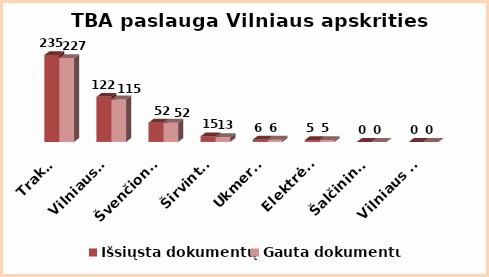
| Category | Išsiųsta dokumentų | Gauta dokumentų |
|---|---|---|
| Trakai | 235 | 227 |
| Vilniaus r. | 122 | 115 |
| Švenčionys | 52 | 52 |
| Širvintos | 15 | 13 |
| Ukmergė | 6 | 6 |
| Elektrėnai | 5 | 5 |
| Šalčininkai | 0 | 0 |
| Vilniaus m. | 0 | 0 |